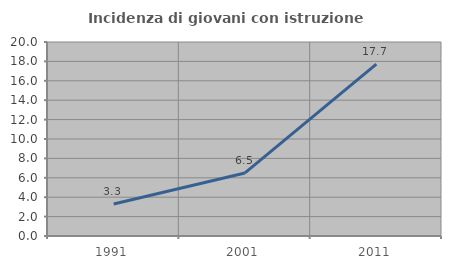
| Category | Incidenza di giovani con istruzione universitaria |
|---|---|
| 1991.0 | 3.302 |
| 2001.0 | 6.498 |
| 2011.0 | 17.717 |